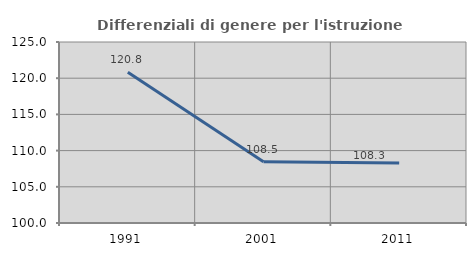
| Category | Differenziali di genere per l'istruzione superiore |
|---|---|
| 1991.0 | 120.836 |
| 2001.0 | 108.47 |
| 2011.0 | 108.291 |